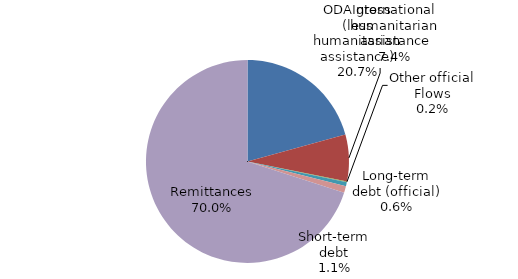
| Category | Series 0 |
|---|---|
| ODA gross (less humanitarian assistance) | 989.692 |
| International humanitarian assistance | 353.328 |
| Other official Flows | 6.89 |
| Peacekeeping | 0 |
| Long-term debt (official) | 30.678 |
| Foreign direct investment | 0 |
| Long-term debt (commercial) | 0 |
| Short-term debt | 50 |
| Net portfolio equity | 0 |
| Remittances | 3342.5 |